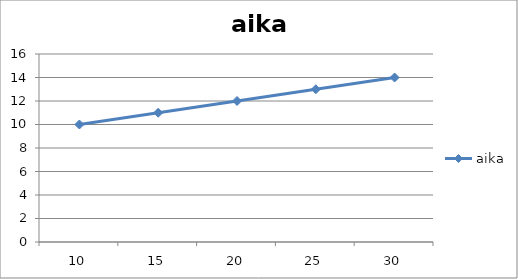
| Category | aika |
|---|---|
| 10 | 10 |
| 15 | 11 |
| 20 | 12 |
| 25 | 13 |
| 30 | 14 |